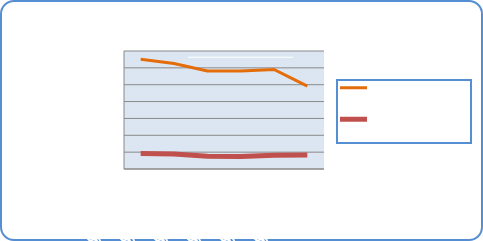
| Category | Motorin Türleri  | Benzin Türleri |
|---|---|---|
| 5/14/18 | 65109422.173 | 9160527.661 |
| 5/15/18 | 62633443.567 | 8832617.217 |
| 5/16/18 | 58120700.402 | 7498500.259 |
| 5/17/18 | 58070809.249 | 7384906.818 |
| 5/18/18 | 59079865.05 | 8169322.545 |
| 5/19/18 | 49151640.99 | 8349986.82 |